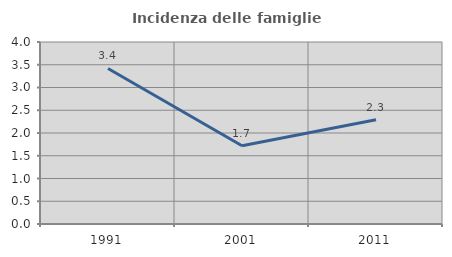
| Category | Incidenza delle famiglie numerose |
|---|---|
| 1991.0 | 3.418 |
| 2001.0 | 1.721 |
| 2011.0 | 2.291 |